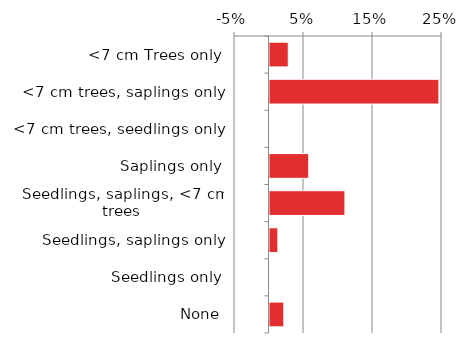
| Category | Native |
|---|---|
| None | 0.022 |
| Seedlings only | 0 |
| Seedlings, saplings only | 0.014 |
| Seedlings, saplings, <7 cm trees | 0.111 |
| Saplings only | 0.058 |
| <7 cm trees, seedlings only | 0 |
| <7 cm trees, saplings only | 0.247 |
| <7 cm Trees only | 0.029 |